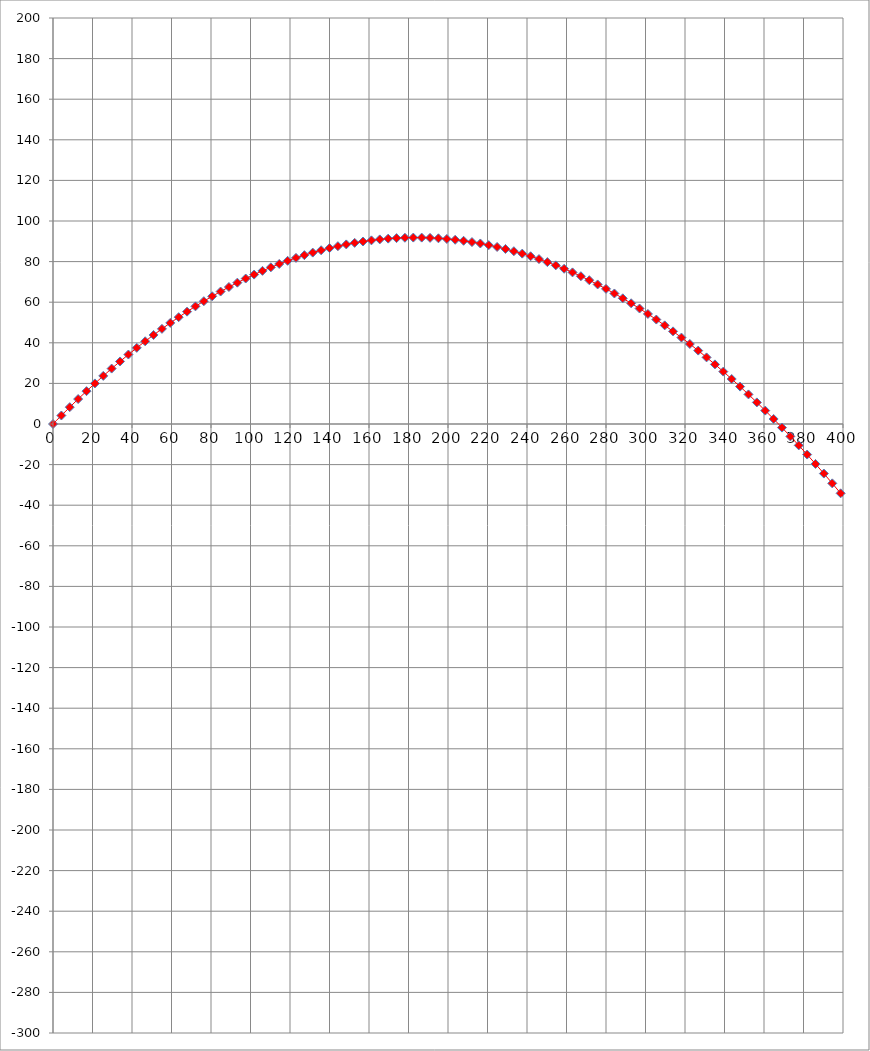
| Category | Series 0 |
|---|---|
| 0.0 | 0 |
| 4.242640687119286 | 4.194 |
| 8.485281374238571 | 8.289 |
| 12.727922061357855 | 12.287 |
| 16.970562748477143 | 16.187 |
| 21.213203435596427 | 19.988 |
| 25.45584412271571 | 23.692 |
| 29.698484809834994 | 27.297 |
| 33.941125496954285 | 30.805 |
| 38.18376618407357 | 34.215 |
| 42.42640687119285 | 37.526 |
| 46.669047558312144 | 40.74 |
| 50.91168824543142 | 43.856 |
| 55.15432893255071 | 46.873 |
| 59.39696961966999 | 49.793 |
| 63.63961030678928 | 52.615 |
| 67.88225099390857 | 55.338 |
| 72.12489168102785 | 57.964 |
| 76.36753236814714 | 60.492 |
| 80.61017305526642 | 62.921 |
| 84.8528137423857 | 65.253 |
| 89.095454429505 | 67.486 |
| 93.33809511662429 | 69.622 |
| 97.58073580374355 | 71.66 |
| 101.82337649086284 | 73.599 |
| 106.06601717798213 | 75.441 |
| 110.30865786510142 | 77.185 |
| 114.55129855222071 | 78.83 |
| 118.79393923933998 | 80.378 |
| 123.03657992645927 | 81.828 |
| 127.27922061357856 | 83.179 |
| 131.52186130069785 | 84.433 |
| 135.76450198781714 | 85.589 |
| 140.0071426749364 | 86.646 |
| 144.2497833620557 | 87.606 |
| 148.49242404917499 | 88.467 |
| 152.73506473629428 | 89.231 |
| 156.97770542341357 | 89.897 |
| 161.22034611053283 | 90.464 |
| 165.46298679765212 | 90.934 |
| 169.7056274847714 | 91.306 |
| 173.94826817189067 | 91.579 |
| 178.19090885901 | 91.755 |
| 182.43354954612926 | 91.833 |
| 186.67619023324858 | 91.812 |
| 190.91883092036784 | 91.694 |
| 195.1614716074871 | 91.477 |
| 199.40411229460642 | 91.163 |
| 203.64675298172568 | 90.751 |
| 207.889393668845 | 90.24 |
| 212.13203435596427 | 89.632 |
| 216.37467504308353 | 88.926 |
| 220.61731573020285 | 88.121 |
| 224.8599564173221 | 87.219 |
| 229.10259710444143 | 86.219 |
| 233.3452377915607 | 85.12 |
| 237.58787847867995 | 83.924 |
| 241.83051916579927 | 82.63 |
| 246.07315985291854 | 81.237 |
| 250.31580054003786 | 79.747 |
| 254.55844122715712 | 78.158 |
| 258.8010819142764 | 76.472 |
| 263.0437226013957 | 74.688 |
| 267.28636328851496 | 72.805 |
| 271.5290039756343 | 70.825 |
| 275.77164466275354 | 68.747 |
| 280.0142853498728 | 66.57 |
| 284.2569260369921 | 64.296 |
| 288.4995667241114 | 61.924 |
| 292.7422074112307 | 59.453 |
| 296.98484809834997 | 56.885 |
| 301.22748878546923 | 54.218 |
| 305.47012947258855 | 51.454 |
| 309.7127701597078 | 48.592 |
| 313.95541084682714 | 45.631 |
| 318.1980515339464 | 42.573 |
| 322.44069222106566 | 39.417 |
| 326.683332908185 | 36.162 |
| 330.92597359530424 | 32.81 |
| 335.16861428242356 | 29.36 |
| 339.4112549695428 | 25.811 |
| 343.6538956566621 | 22.165 |
| 347.89653634378135 | 18.421 |
| 352.1391770309007 | 14.578 |
| 356.38181771802 | 10.638 |
| 360.62445840513925 | 6.599 |
| 364.8670990922585 | 2.463 |
| 369.1097397793778 | -1.771 |
| 373.35238046649715 | -6.104 |
| 377.5950211536164 | -10.534 |
| 381.8376618407357 | -15.062 |
| 386.08030252785494 | -19.689 |
| 390.3229432149742 | -24.413 |
| 394.5655839020936 | -29.235 |
| 398.80822458921284 | -34.156 |
| 403.0508652763321 | -39.174 |
| 407.29350596345137 | -44.29 |
| 411.53614665057063 | -49.505 |
| 415.77878733769 | -54.817 |
| 420.02142802480927 | -60.228 |
| 424.26406871192853 | -65.736 |
| 428.5067093990478 | -71.342 |
| 432.74935008616706 | -77.047 |
| 436.99199077328643 | -82.849 |
| 441.2346314604057 | -88.749 |
| 445.47727214752496 | -94.748 |
| 449.7199128346442 | -100.844 |
| 453.9625535217635 | -107.038 |
| 458.20519420888286 | -113.331 |
| 462.4478348960021 | -119.721 |
| 466.6904755831214 | -126.21 |
| 470.93311627024065 | -132.796 |
| 475.1757569573599 | -139.48 |
| 479.4183976444793 | -146.263 |
| 483.66103833159855 | -153.143 |
| 487.9036790187178 | -160.121 |
| 492.1463197058371 | -167.198 |
| 496.38896039295633 | -174.372 |
| 500.6316010800757 | -181.644 |
| 504.874241767195 | -189.015 |
| 509.11688245431424 | -196.483 |